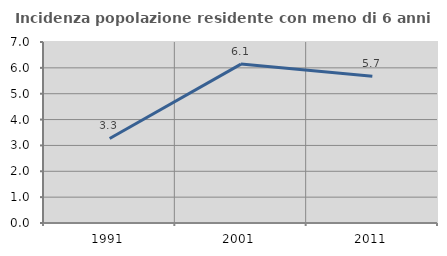
| Category | Incidenza popolazione residente con meno di 6 anni |
|---|---|
| 1991.0 | 3.269 |
| 2001.0 | 6.145 |
| 2011.0 | 5.68 |